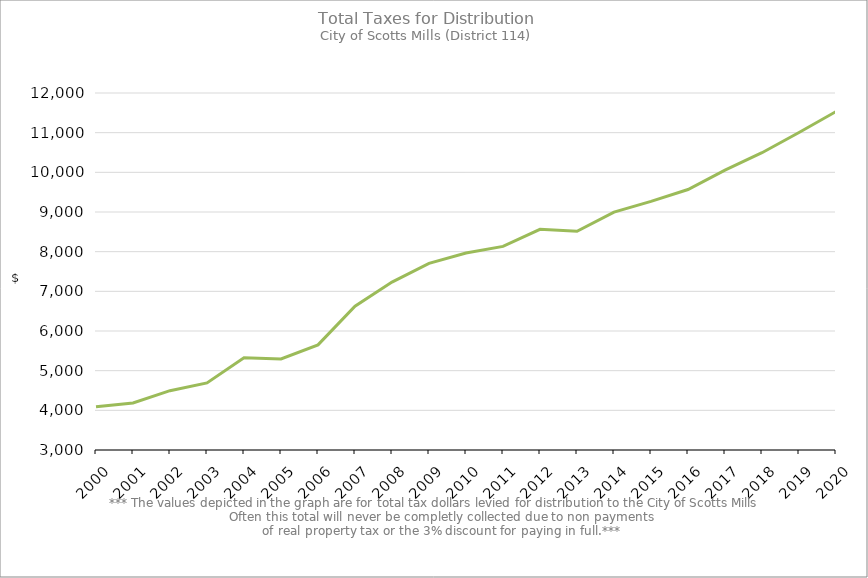
| Category | Series 0 |
|---|---|
| 2000.0 | 4087.82 |
| 2001.0 | 4187.18 |
| 2002.0 | 4495.13 |
| 2003.0 | 4690.77 |
| 2004.0 | 5322.9 |
| 2005.0 | 5294.06 |
| 2006.0 | 5649.88 |
| 2007.0 | 6625.95 |
| 2008.0 | 7233.72 |
| 2009.0 | 7704.91 |
| 2010.0 | 7966.98 |
| 2011.0 | 8133.36 |
| 2012.0 | 8564.15 |
| 2013.0 | 8513.14 |
| 2014.0 | 8997.94 |
| 2015.0 | 9268.96 |
| 2016.0 | 9567.17 |
| 2017.0 | 10056.86 |
| 2018.0 | 10494.84 |
| 2019.0 | 11005.31 |
| 2020.0 | 11532.17 |